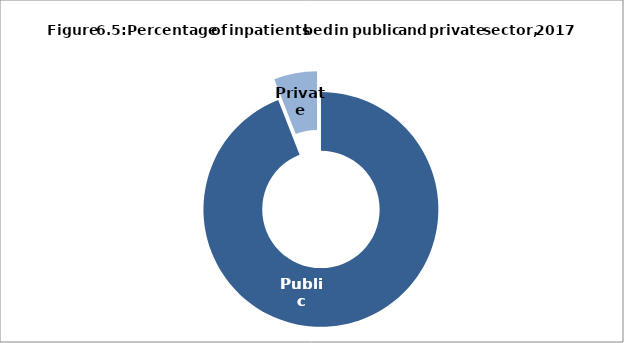
| Category | Series 0 |
|---|---|
| Public | 1634 |
| Private | 103 |